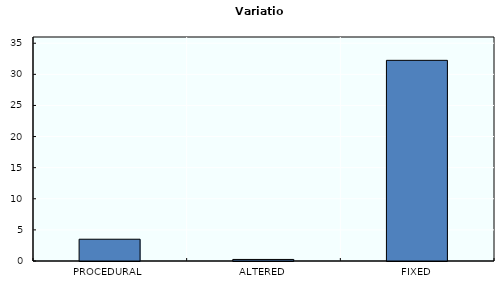
| Category | Variation |
|---|---|
| PROCEDURAL | 3.5 |
| ALTERED | 0.25 |
| FIXED | 32.25 |